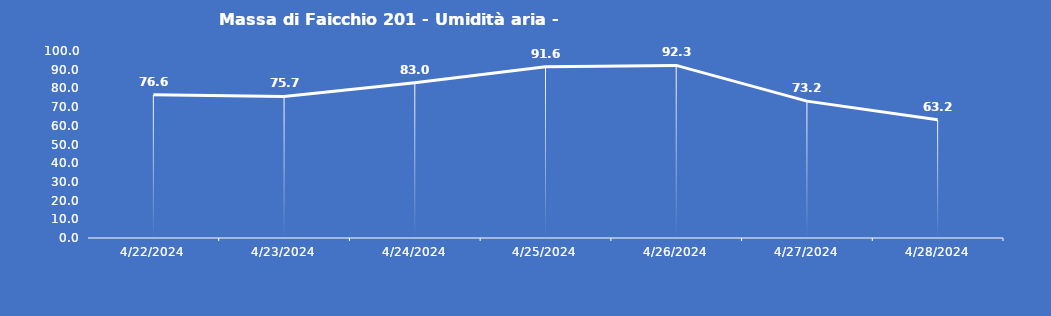
| Category | Massa di Faicchio 201 - Umidità aria - Grezzo (%) |
|---|---|
| 4/22/24 | 76.6 |
| 4/23/24 | 75.7 |
| 4/24/24 | 83 |
| 4/25/24 | 91.6 |
| 4/26/24 | 92.3 |
| 4/27/24 | 73.2 |
| 4/28/24 | 63.2 |